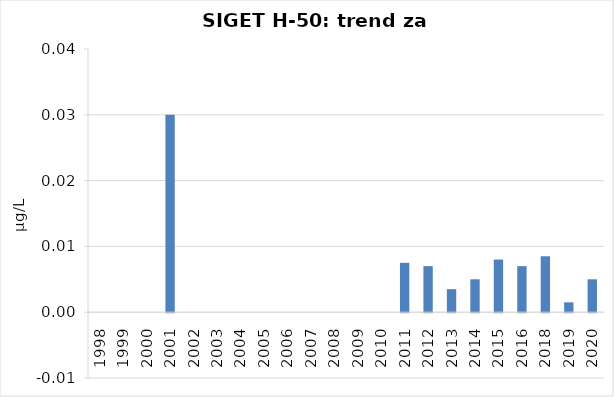
| Category | Vsota |
|---|---|
| 1998 | 0 |
| 1999 | 0 |
| 2000 | 0 |
| 2001 | 0.03 |
| 2002 | 0 |
| 2003 | 0 |
| 2004 | 0 |
| 2005 | 0 |
| 2006 | 0 |
| 2007 | 0 |
| 2008 | 0 |
| 2009 | 0 |
| 2010 | 0 |
| 2011 | 0.008 |
| 2012 | 0.007 |
| 2013 | 0.004 |
| 2014 | 0.005 |
| 2015 | 0.008 |
| 2016 | 0.007 |
| 2018 | 0.008 |
| 2019 | 0.002 |
| 2020 | 0.005 |